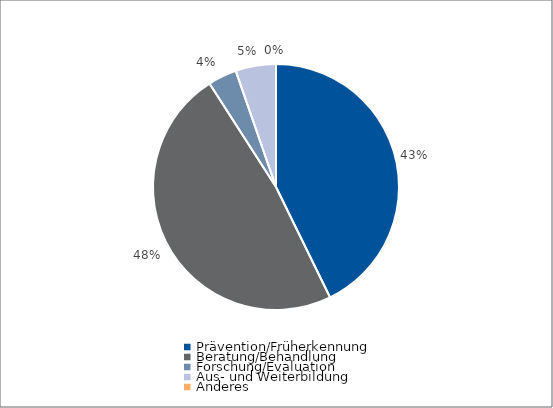
| Category | Series 0 |
|---|---|
| Prävention/Früherkennung | 28545 |
| Beratung/Behandlung | 32158 |
| Forschung/Evaluation | 2525 |
| Aus- und Weiterbildung | 3547 |
| Anderes | 0 |